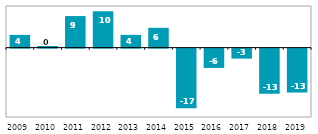
| Category | CZK billion |
|---|---|
| 2009 | 3.676 |
| 2010 | 0.47 |
| 2011 | 9.099 |
| 2012 | 10.481 |
| 2013 | 3.676 |
| 2014 | 5.713 |
| 2015 | -17.201 |
| 2016 | -5.567 |
| 2017 | -2.881 |
| 2018 | -13.033 |
| 2019 | -12.653 |